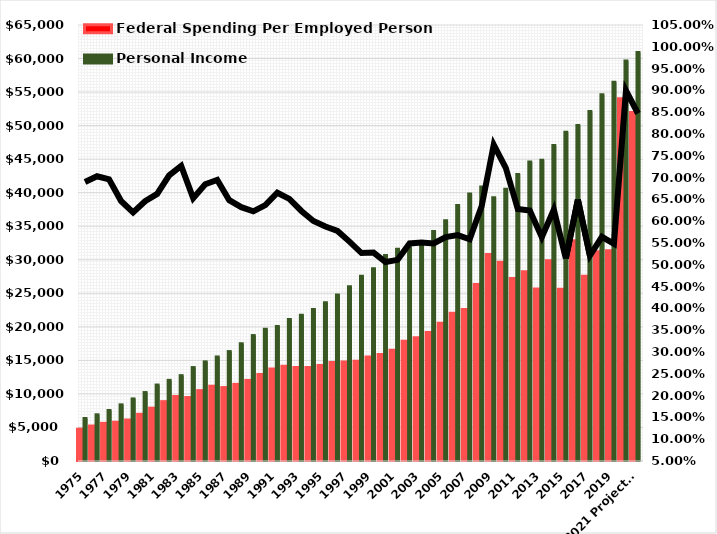
| Category | Federal Spending Per Employed Person | Personal Income |
|---|---|---|
| 1975 | 4374.255 | 6340 |
| 1976 | 4843.573 | 6890 |
| 1977 | 5242.013 | 7532 |
| 1978 | 5410.18 | 8371 |
| 1979 | 5739.358 | 9252 |
| 1980 | 6590.871 | 10204 |
| 1981 | 7504.061 | 11326 |
| 1982 | 8476.998 | 12021 |
| 1983 | 9247.03 | 12721 |
| 1984 | 9089.64 | 13929 |
| 1985 | 10118.84 | 14779 |
| 1986 | 10776.502 | 15510 |
| 1987 | 10573.796 | 16313 |
| 1988 | 11050.005 | 17479 |
| 1989 | 11641.193 | 18698 |
| 1990 | 12512.059 | 19641 |
| 1991 | 13343.201 | 20056 |
| 1992 | 13740.091 | 21099 |
| 1993 | 13554.059 | 21738 |
| 1994 | 13558.19 | 22574 |
| 1995 | 13874.929 | 23600 |
| 1996 | 14304.067 | 24762 |
| 1997 | 14373.715 | 25984 |
| 1998 | 14513.74 | 27545 |
| 1999 | 15126.822 | 28647 |
| 2000 | 15515.858 | 30640 |
| 2001 | 16143.776 | 31574 |
| 2002 | 17465.628 | 31807 |
| 2003 | 17984.888 | 32645 |
| 2004 | 18782.584 | 34219 |
| 2005 | 20177.669 | 35806 |
| 2006 | 21643.579 | 38089 |
| 2007 | 22231.016 | 39801 |
| 2008 | 25937.918 | 40855 |
| 2009 | 30427.264 | 39250 |
| 2010 | 29275.473 | 40518 |
| 2011 | 26825.692 | 42713 |
| 2012 | 27853.124 | 44588 |
| 2013 | 25254.689 | 44826 |
| 2014 | 29488.293 | 47050 |
| 2015 | 25213.842 | 48998 |
| 2016 | 32476.256 | 50004 |
| 2017 | 27165.859 | 52114 |
| 2018 | 30804.371 | 54601 |
| 2019 | 30956.179 | 56469 |
| 2020 | 53647.103 | 59642 |
| 2021 Projected | 51581.147 | 60894.482 |